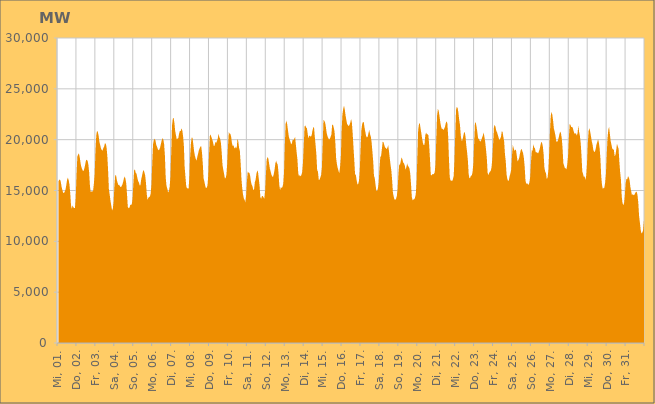
| Category | Series 0 |
|---|---|
|  Mi, 01.  | 15880.041 |
|  Mi, 01.  | 16034.122 |
|  Mi, 01.  | 16085.192 |
|  Mi, 01.  | 15870.947 |
|  Mi, 01.  | 15383.045 |
|  Mi, 01.  | 15050.116 |
|  Mi, 01.  | 14788.443 |
|  Mi, 01.  | 14753.493 |
|  Mi, 01.  | 14880.313 |
|  Mi, 01.  | 15084.558 |
|  Mi, 01.  | 15527.046 |
|  Mi, 01.  | 16042.473 |
|  Mi, 01.  | 16257.262 |
|  Mi, 01.  | 16038.109 |
|  Mi, 01.  | 15592.112 |
|  Mi, 01.  | 14759.255 |
|  Mi, 01.  | 13544.057 |
|  Do, 02.  | 13185.308 |
|  Do, 02.  | 13539.781 |
|  Do, 02.  | 13343.718 |
|  Do, 02.  | 13276.531 |
|  Do, 02.  | 13268.497 |
|  Do, 02.  | 14324.493 |
|  Do, 02.  | 16546.321 |
|  Do, 02.  | 18334.495 |
|  Do, 02.  | 18529.386 |
|  Do, 02.  | 18645.829 |
|  Do, 02.  | 18298.354 |
|  Do, 02.  | 17743.645 |
|  Do, 02.  | 17327.552 |
|  Do, 02.  | 17116.565 |
|  Do, 02.  | 16951.213 |
|  Do, 02.  | 16925.661 |
|  Do, 02.  | 17204.78 |
|  Do, 02.  | 17580.497 |
|  Do, 02.  | 17954.326 |
|  Do, 02.  | 18026.506 |
|  Do, 02.  | 17922.085 |
|  Do, 02.  | 17527.998 |
|  Do, 02.  | 16774.685 |
|  Do, 02.  | 15423.487 |
|  Fr, 03.  | 14831.139 |
|  Fr, 03.  | 14932.915 |
|  Fr, 03.  | 14888.233 |
|  Fr, 03.  | 14989.779 |
|  Fr, 03.  | 15675.474 |
|  Fr, 03.  | 16621.835 |
|  Fr, 03.  | 18924.878 |
|  Fr, 03.  | 20422.545 |
|  Fr, 03.  | 20873.764 |
|  Fr, 03.  | 20752.088 |
|  Fr, 03.  | 20384.484 |
|  Fr, 03.  | 19778.757 |
|  Fr, 03.  | 19476.086 |
|  Fr, 03.  | 19128.711 |
|  Fr, 03.  | 18979.027 |
|  Fr, 03.  | 18930.172 |
|  Fr, 03.  | 19176.02 |
|  Fr, 03.  | 19332.624 |
|  Fr, 03.  | 19640.675 |
|  Fr, 03.  | 19613.561 |
|  Fr, 03.  | 19270.293 |
|  Fr, 03.  | 18414.271 |
|  Fr, 03.  | 16966.94 |
|  Fr, 03.  | 15114.73 |
|  Sa, 04.  | 14612.082 |
|  Sa, 04.  | 13985.811 |
|  Sa, 04.  | 13521.356 |
|  Sa, 04.  | 13044.978 |
|  Sa, 04.  | 13217.953 |
|  Sa, 04.  | 13889.212 |
|  Sa, 04.  | 15426.012 |
|  Sa, 04.  | 16461.014 |
|  Sa, 04.  | 16533.182 |
|  Sa, 04.  | 16057.003 |
|  Sa, 04.  | 15760.044 |
|  Sa, 04.  | 15549.797 |
|  Sa, 04.  | 15554.22 |
|  Sa, 04.  | 15423.924 |
|  Sa, 04.  | 15330.903 |
|  Sa, 04.  | 15406.458 |
|  Sa, 04.  | 15567.541 |
|  Sa, 04.  | 15827.533 |
|  Sa, 04.  | 16173.715 |
|  Sa, 04.  | 16384.077 |
|  Sa, 04.  | 16154.24 |
|  Sa, 04.  | 15698.653 |
|  Sa, 04.  | 14590.799 |
|  Sa, 04.  | 13380.864 |
|  So, 05.  | 13252.382 |
|  So, 05.  | 13308.067 |
|  So, 05.  | 13564.349 |
|  So, 05.  | 13605.745 |
|  So, 05.  | 13624.813 |
|  So, 05.  | 14231.309 |
|  So, 05.  | 15653.347 |
|  So, 05.  | 16980.263 |
|  So, 05.  | 17071.013 |
|  So, 05.  | 16729.561 |
|  So, 05.  | 16661.179 |
|  So, 05.  | 16287.891 |
|  So, 05.  | 15949.642 |
|  So, 05.  | 15797.782 |
|  So, 05.  | 15513.905 |
|  So, 05.  | 15527.349 |
|  So, 05.  | 16120.102 |
|  So, 05.  | 16438.563 |
|  So, 05.  | 16838.327 |
|  So, 05.  | 17015.614 |
|  So, 05.  | 16801.253 |
|  So, 05.  | 16489.51 |
|  So, 05.  | 15761.237 |
|  So, 05.  | 14645.248 |
|  Mo, 06.  | 14077.656 |
|  Mo, 06.  | 14279.456 |
|  Mo, 06.  | 14371.757 |
|  Mo, 06.  | 14404.387 |
|  Mo, 06.  | 14709.623 |
|  Mo, 06.  | 15647.929 |
|  Mo, 06.  | 17808.847 |
|  Mo, 06.  | 19580.43 |
|  Mo, 06.  | 19958.468 |
|  Mo, 06.  | 20102.531 |
|  Mo, 06.  | 19925.509 |
|  Mo, 06.  | 19492.374 |
|  Mo, 06.  | 19316.96 |
|  Mo, 06.  | 19071.961 |
|  Mo, 06.  | 18957.447 |
|  Mo, 06.  | 19039.489 |
|  Mo, 06.  | 19253.172 |
|  Mo, 06.  | 19615.031 |
|  Mo, 06.  | 19939.709 |
|  Mo, 06.  | 20167.338 |
|  Mo, 06.  | 20010.564 |
|  Mo, 06.  | 19557.624 |
|  Mo, 06.  | 18429.47 |
|  Mo, 06.  | 16313.459 |
|  Di, 07.  | 15460.943 |
|  Di, 07.  | 15186.29 |
|  Di, 07.  | 14807.417 |
|  Di, 07.  | 14923.011 |
|  Di, 07.  | 15358.95 |
|  Di, 07.  | 16326.431 |
|  Di, 07.  | 18744.26 |
|  Di, 07.  | 21374.51 |
|  Di, 07.  | 22057.131 |
|  Di, 07.  | 22163.99 |
|  Di, 07.  | 21668.681 |
|  Di, 07.  | 20855.01 |
|  Di, 07.  | 20453.689 |
|  Di, 07.  | 20022.649 |
|  Di, 07.  | 20097.719 |
|  Di, 07.  | 20164.575 |
|  Di, 07.  | 20600.641 |
|  Di, 07.  | 20866.397 |
|  Di, 07.  | 20845.868 |
|  Di, 07.  | 21113.432 |
|  Di, 07.  | 20930.506 |
|  Di, 07.  | 20367.816 |
|  Di, 07.  | 19468.109 |
|  Di, 07.  | 17361.251 |
|  Mi, 08.  | 16383.988 |
|  Mi, 08.  | 15448.785 |
|  Mi, 08.  | 15216.931 |
|  Mi, 08.  | 15213.723 |
|  Mi, 08.  | 15159.305 |
|  Mi, 08.  | 16350.492 |
|  Mi, 08.  | 18376.808 |
|  Mi, 08.  | 19673.498 |
|  Mi, 08.  | 20209.771 |
|  Mi, 08.  | 20179.549 |
|  Mi, 08.  | 19563.683 |
|  Mi, 08.  | 18856.715 |
|  Mi, 08.  | 18421.741 |
|  Mi, 08.  | 18141.797 |
|  Mi, 08.  | 17931.113 |
|  Mi, 08.  | 18285.161 |
|  Mi, 08.  | 18597.726 |
|  Mi, 08.  | 18935.935 |
|  Mi, 08.  | 19150.474 |
|  Mi, 08.  | 19309.904 |
|  Mi, 08.  | 19364.358 |
|  Mi, 08.  | 18730.201 |
|  Mi, 08.  | 17663.766 |
|  Mi, 08.  | 16191.754 |
|  Do, 09.  | 15892.97 |
|  Do, 09.  | 15498.623 |
|  Do, 09.  | 15238.641 |
|  Do, 09.  | 15276.099 |
|  Do, 09.  | 15500.022 |
|  Do, 09.  | 16552.781 |
|  Do, 09.  | 18679.384 |
|  Do, 09.  | 20365.526 |
|  Do, 09.  | 20523.494 |
|  Do, 09.  | 20223.417 |
|  Do, 09.  | 20026.581 |
|  Do, 09.  | 19733.31 |
|  Do, 09.  | 19374.838 |
|  Do, 09.  | 19419.141 |
|  Do, 09.  | 19768.99 |
|  Do, 09.  | 19686.396 |
|  Do, 09.  | 19865.239 |
|  Do, 09.  | 20117.086 |
|  Do, 09.  | 20591.997 |
|  Do, 09.  | 20233.36 |
|  Do, 09.  | 20082.685 |
|  Do, 09.  | 19670.782 |
|  Do, 09.  | 18723.395 |
|  Do, 09.  | 17511.287 |
|  Fr, 10.  | 17037.412 |
|  Fr, 10.  | 16636.664 |
|  Fr, 10.  | 16203.845 |
|  Fr, 10.  | 16219.213 |
|  Fr, 10.  | 16579.176 |
|  Fr, 10.  | 17677.642 |
|  Fr, 10.  | 19413.372 |
|  Fr, 10.  | 20752.068 |
|  Fr, 10.  | 20598.591 |
|  Fr, 10.  | 20567.151 |
|  Fr, 10.  | 20266.1 |
|  Fr, 10.  | 19657.743 |
|  Fr, 10.  | 19372.545 |
|  Fr, 10.  | 19450.543 |
|  Fr, 10.  | 19174.48 |
|  Fr, 10.  | 19150.988 |
|  Fr, 10.  | 19310.221 |
|  Fr, 10.  | 19128.172 |
|  Fr, 10.  | 20125.229 |
|  Fr, 10.  | 19832.548 |
|  Fr, 10.  | 19200.393 |
|  Fr, 10.  | 18877.442 |
|  Fr, 10.  | 17701.637 |
|  Fr, 10.  | 16155.879 |
|  Sa, 11.  | 15246.987 |
|  Sa, 11.  | 14600.332 |
|  Sa, 11.  | 14239.275 |
|  Sa, 11.  | 14074.015 |
|  Sa, 11.  | 13847.225 |
|  Sa, 11.  | 14582.451 |
|  Sa, 11.  | 15938.336 |
|  Sa, 11.  | 16902.586 |
|  Sa, 11.  | 16742.432 |
|  Sa, 11.  | 16744.732 |
|  Sa, 11.  | 16461.098 |
|  Sa, 11.  | 15885.927 |
|  Sa, 11.  | 15571.146 |
|  Sa, 11.  | 15411.787 |
|  Sa, 11.  | 15049.862 |
|  Sa, 11.  | 15098.78 |
|  Sa, 11.  | 15829.965 |
|  Sa, 11.  | 16076.397 |
|  Sa, 11.  | 16635.179 |
|  Sa, 11.  | 16969.503 |
|  Sa, 11.  | 16819.857 |
|  Sa, 11.  | 16149.63 |
|  Sa, 11.  | 15454.834 |
|  Sa, 11.  | 14352.98 |
|  So, 12.  | 14175.853 |
|  So, 12.  | 14469.028 |
|  So, 12.  | 14453.263 |
|  So, 12.  | 14327.082 |
|  So, 12.  | 14187.671 |
|  So, 12.  | 14941.169 |
|  So, 12.  | 16566.547 |
|  So, 12.  | 18031.981 |
|  So, 12.  | 18290.863 |
|  So, 12.  | 18168.057 |
|  So, 12.  | 17690.295 |
|  So, 12.  | 17161.356 |
|  So, 12.  | 16879.082 |
|  So, 12.  | 16565.149 |
|  So, 12.  | 16379.729 |
|  So, 12.  | 16337.529 |
|  So, 12.  | 16612.5 |
|  So, 12.  | 17048.215 |
|  So, 12.  | 17664.742 |
|  So, 12.  | 17927.058 |
|  So, 12.  | 17687.299 |
|  So, 12.  | 17528.606 |
|  So, 12.  | 16733.919 |
|  So, 12.  | 15541.055 |
|  Mo, 13.  | 15031.703 |
|  Mo, 13.  | 15351.982 |
|  Mo, 13.  | 15231.163 |
|  Mo, 13.  | 15355 |
|  Mo, 13.  | 15667.753 |
|  Mo, 13.  | 16790.889 |
|  Mo, 13.  | 19483.726 |
|  Mo, 13.  | 21570.672 |
|  Mo, 13.  | 21870.924 |
|  Mo, 13.  | 21504.529 |
|  Mo, 13.  | 20913.836 |
|  Mo, 13.  | 20324.873 |
|  Mo, 13.  | 20043.221 |
|  Mo, 13.  | 19806.895 |
|  Mo, 13.  | 19544.648 |
|  Mo, 13.  | 19662.927 |
|  Mo, 13.  | 20006.334 |
|  Mo, 13.  | 19958.419 |
|  Mo, 13.  | 20087.852 |
|  Mo, 13.  | 20273.394 |
|  Mo, 13.  | 19503.34 |
|  Mo, 13.  | 18721.099 |
|  Mo, 13.  | 18021.71 |
|  Mo, 13.  | 16706.814 |
|  Di, 14.  | 16387.099 |
|  Di, 14.  | 16546 |
|  Di, 14.  | 16390.004 |
|  Di, 14.  | 16526.528 |
|  Di, 14.  | 16824.149 |
|  Di, 14.  | 17735.442 |
|  Di, 14.  | 19448.236 |
|  Di, 14.  | 21292.098 |
|  Di, 14.  | 21405.298 |
|  Di, 14.  | 21195.148 |
|  Di, 14.  | 21130.317 |
|  Di, 14.  | 20559.042 |
|  Di, 14.  | 20125.591 |
|  Di, 14.  | 20407.556 |
|  Di, 14.  | 20355.032 |
|  Di, 14.  | 20284.389 |
|  Di, 14.  | 20431.3 |
|  Di, 14.  | 20878.607 |
|  Di, 14.  | 21203.722 |
|  Di, 14.  | 21214.099 |
|  Di, 14.  | 20268.05 |
|  Di, 14.  | 19469.083 |
|  Di, 14.  | 18514.477 |
|  Di, 14.  | 16991.559 |
|  Mi, 15.  | 16847.458 |
|  Mi, 15.  | 16040.803 |
|  Mi, 15.  | 16061.648 |
|  Mi, 15.  | 16283.236 |
|  Mi, 15.  | 16520.522 |
|  Mi, 15.  | 17273.901 |
|  Mi, 15.  | 19612.663 |
|  Mi, 15.  | 21963.743 |
|  Mi, 15.  | 21858.682 |
|  Mi, 15.  | 21707.712 |
|  Mi, 15.  | 21252.427 |
|  Mi, 15.  | 20686.306 |
|  Mi, 15.  | 20357.232 |
|  Mi, 15.  | 20157.41 |
|  Mi, 15.  | 20002.422 |
|  Mi, 15.  | 20093.886 |
|  Mi, 15.  | 20264.008 |
|  Mi, 15.  | 20517.939 |
|  Mi, 15.  | 21456.077 |
|  Mi, 15.  | 21466.068 |
|  Mi, 15.  | 21188.254 |
|  Mi, 15.  | 20784.67 |
|  Mi, 15.  | 19743.887 |
|  Mi, 15.  | 18204.608 |
|  Do, 16.  | 17605.861 |
|  Do, 16.  | 17215.191 |
|  Do, 16.  | 16951.032 |
|  Do, 16.  | 16688.128 |
|  Do, 16.  | 17303.665 |
|  Do, 16.  | 18294.239 |
|  Do, 16.  | 20916.964 |
|  Do, 16.  | 22470.083 |
|  Do, 16.  | 23029.637 |
|  Do, 16.  | 23336.985 |
|  Do, 16.  | 22952.673 |
|  Do, 16.  | 22362.799 |
|  Do, 16.  | 21910.078 |
|  Do, 16.  | 21530.37 |
|  Do, 16.  | 21439.008 |
|  Do, 16.  | 21323.838 |
|  Do, 16.  | 21477.209 |
|  Do, 16.  | 21678.888 |
|  Do, 16.  | 22021.014 |
|  Do, 16.  | 21668.792 |
|  Do, 16.  | 20598.531 |
|  Do, 16.  | 19264.384 |
|  Do, 16.  | 18021.871 |
|  Do, 16.  | 16615.195 |
|  Fr, 17.  | 16531.623 |
|  Fr, 17.  | 16014.392 |
|  Fr, 17.  | 15599.381 |
|  Fr, 17.  | 15631.952 |
|  Fr, 17.  | 15952.585 |
|  Fr, 17.  | 16987.947 |
|  Fr, 17.  | 19032.814 |
|  Fr, 17.  | 20926.23 |
|  Fr, 17.  | 21521.362 |
|  Fr, 17.  | 21742.12 |
|  Fr, 17.  | 21731.842 |
|  Fr, 17.  | 21194.14 |
|  Fr, 17.  | 20789.732 |
|  Fr, 17.  | 20356.575 |
|  Fr, 17.  | 20218.214 |
|  Fr, 17.  | 20286.363 |
|  Fr, 17.  | 20640.871 |
|  Fr, 17.  | 20967.495 |
|  Fr, 17.  | 20528.448 |
|  Fr, 17.  | 20304.983 |
|  Fr, 17.  | 19734.042 |
|  Fr, 17.  | 18814.484 |
|  Fr, 17.  | 17879.036 |
|  Fr, 17.  | 16434.109 |
|  Sa, 18.  | 16199.459 |
|  Sa, 18.  | 15538.8 |
|  Sa, 18.  | 14968.539 |
|  Sa, 18.  | 14953.717 |
|  Sa, 18.  | 15237.275 |
|  Sa, 18.  | 15791.739 |
|  Sa, 18.  | 17204.994 |
|  Sa, 18.  | 18283.453 |
|  Sa, 18.  | 18401.569 |
|  Sa, 18.  | 19071.108 |
|  Sa, 18.  | 19802.959 |
|  Sa, 18.  | 19756.433 |
|  Sa, 18.  | 19486.193 |
|  Sa, 18.  | 19237.859 |
|  Sa, 18.  | 19184.197 |
|  Sa, 18.  | 19067.496 |
|  Sa, 18.  | 19200.048 |
|  Sa, 18.  | 19462.315 |
|  Sa, 18.  | 18882.537 |
|  Sa, 18.  | 18175.165 |
|  Sa, 18.  | 17522.573 |
|  Sa, 18.  | 16960.988 |
|  Sa, 18.  | 16015.739 |
|  Sa, 18.  | 14795.914 |
|  So, 19.  | 14392.189 |
|  So, 19.  | 14114.877 |
|  So, 19.  | 14074.014 |
|  So, 19.  | 14204.609 |
|  So, 19.  | 14473.675 |
|  So, 19.  | 15143.798 |
|  So, 19.  | 16607.353 |
|  So, 19.  | 17577.062 |
|  So, 19.  | 17522.72 |
|  So, 19.  | 17910.223 |
|  So, 19.  | 18261.334 |
|  So, 19.  | 18064.018 |
|  So, 19.  | 17759.215 |
|  So, 19.  | 17672.121 |
|  So, 19.  | 17466.892 |
|  So, 19.  | 17052.788 |
|  So, 19.  | 17283.407 |
|  So, 19.  | 17645.552 |
|  So, 19.  | 17434.072 |
|  So, 19.  | 17322.944 |
|  So, 19.  | 17157.905 |
|  So, 19.  | 16641.106 |
|  So, 19.  | 15551.245 |
|  So, 19.  | 14344.445 |
|  Mo, 20.  | 14045.04 |
|  Mo, 20.  | 14117.585 |
|  Mo, 20.  | 14143.037 |
|  Mo, 20.  | 14297.298 |
|  Mo, 20.  | 14661.214 |
|  Mo, 20.  | 15851.486 |
|  Mo, 20.  | 18434.539 |
|  Mo, 20.  | 20933.926 |
|  Mo, 20.  | 21509.881 |
|  Mo, 20.  | 21651.709 |
|  Mo, 20.  | 21125.732 |
|  Mo, 20.  | 20629.734 |
|  Mo, 20.  | 20119.44 |
|  Mo, 20.  | 19681.526 |
|  Mo, 20.  | 19468.253 |
|  Mo, 20.  | 19507.296 |
|  Mo, 20.  | 20433.905 |
|  Mo, 20.  | 20683.649 |
|  Mo, 20.  | 20535.315 |
|  Mo, 20.  | 20529.948 |
|  Mo, 20.  | 20425.819 |
|  Mo, 20.  | 19420.128 |
|  Mo, 20.  | 18058.279 |
|  Mo, 20.  | 16547.298 |
|  Di, 21.  | 16473.199 |
|  Di, 21.  | 16615.035 |
|  Di, 21.  | 16598.876 |
|  Di, 21.  | 16634.09 |
|  Di, 21.  | 16801.218 |
|  Di, 21.  | 17602.559 |
|  Di, 21.  | 20210.595 |
|  Di, 21.  | 22374.063 |
|  Di, 21.  | 23021.669 |
|  Di, 21.  | 22839.412 |
|  Di, 21.  | 22334.119 |
|  Di, 21.  | 21735.706 |
|  Di, 21.  | 21286.938 |
|  Di, 21.  | 21049.702 |
|  Di, 21.  | 21072.806 |
|  Di, 21.  | 20949.723 |
|  Di, 21.  | 21086.704 |
|  Di, 21.  | 21265.025 |
|  Di, 21.  | 21624.703 |
|  Di, 21.  | 21812.149 |
|  Di, 21.  | 21592.729 |
|  Di, 21.  | 20354.637 |
|  Di, 21.  | 18145.572 |
|  Di, 21.  | 16323.402 |
|  Mi, 22.  | 15974.487 |
|  Mi, 22.  | 15981.342 |
|  Mi, 22.  | 15927.306 |
|  Mi, 22.  | 16098.273 |
|  Mi, 22.  | 16421.103 |
|  Mi, 22.  | 17924.6 |
|  Mi, 22.  | 20560.961 |
|  Mi, 22.  | 22929.776 |
|  Mi, 22.  | 23230.172 |
|  Mi, 22.  | 23116.132 |
|  Mi, 22.  | 22649.539 |
|  Mi, 22.  | 21946.361 |
|  Mi, 22.  | 21435.504 |
|  Mi, 22.  | 20411.59 |
|  Mi, 22.  | 19895.127 |
|  Mi, 22.  | 19924.83 |
|  Mi, 22.  | 20287.375 |
|  Mi, 22.  | 20658.755 |
|  Mi, 22.  | 20763.781 |
|  Mi, 22.  | 20322.691 |
|  Mi, 22.  | 19435.134 |
|  Mi, 22.  | 18783.215 |
|  Mi, 22.  | 17960.274 |
|  Mi, 22.  | 16623.872 |
|  Do, 23.  | 16175.135 |
|  Do, 23.  | 16275.728 |
|  Do, 23.  | 16467.631 |
|  Do, 23.  | 16471.662 |
|  Do, 23.  | 16863.268 |
|  Do, 23.  | 17705.058 |
|  Do, 23.  | 19719.662 |
|  Do, 23.  | 21701.591 |
|  Do, 23.  | 21670.309 |
|  Do, 23.  | 21281.735 |
|  Do, 23.  | 20746.671 |
|  Do, 23.  | 20114.6 |
|  Do, 23.  | 20086.038 |
|  Do, 23.  | 19874.392 |
|  Do, 23.  | 19816.843 |
|  Do, 23.  | 19965.964 |
|  Do, 23.  | 20202.749 |
|  Do, 23.  | 20407.134 |
|  Do, 23.  | 20702.601 |
|  Do, 23.  | 20254.016 |
|  Do, 23.  | 19754.183 |
|  Do, 23.  | 19027.298 |
|  Do, 23.  | 18193.883 |
|  Do, 23.  | 16765.907 |
|  Fr, 24.  | 16513.192 |
|  Fr, 24.  | 16748.537 |
|  Fr, 24.  | 16851.103 |
|  Fr, 24.  | 16940.665 |
|  Fr, 24.  | 17279.838 |
|  Fr, 24.  | 18160.453 |
|  Fr, 24.  | 19631.992 |
|  Fr, 24.  | 21248.27 |
|  Fr, 24.  | 21456.384 |
|  Fr, 24.  | 21255.988 |
|  Fr, 24.  | 20865.657 |
|  Fr, 24.  | 20713.33 |
|  Fr, 24.  | 20456.714 |
|  Fr, 24.  | 20186.299 |
|  Fr, 24.  | 19962.586 |
|  Fr, 24.  | 20098.472 |
|  Fr, 24.  | 20291.848 |
|  Fr, 24.  | 20836.332 |
|  Fr, 24.  | 20758.583 |
|  Fr, 24.  | 20254.754 |
|  Fr, 24.  | 19801.901 |
|  Fr, 24.  | 18561.67 |
|  Fr, 24.  | 17903.007 |
|  Fr, 24.  | 16606.946 |
|  Sa, 25.  | 16138.333 |
|  Sa, 25.  | 15931.414 |
|  Sa, 25.  | 16028.355 |
|  Sa, 25.  | 16436.465 |
|  Sa, 25.  | 16704.949 |
|  Sa, 25.  | 17069.093 |
|  Sa, 25.  | 18526.396 |
|  Sa, 25.  | 19486.444 |
|  Sa, 25.  | 19172.96 |
|  Sa, 25.  | 18897.336 |
|  Sa, 25.  | 19023.578 |
|  Sa, 25.  | 18973.358 |
|  Sa, 25.  | 18433.435 |
|  Sa, 25.  | 17859.265 |
|  Sa, 25.  | 18000.961 |
|  Sa, 25.  | 18194.41 |
|  Sa, 25.  | 18617.953 |
|  Sa, 25.  | 18961.284 |
|  Sa, 25.  | 19108.906 |
|  Sa, 25.  | 18886.475 |
|  Sa, 25.  | 18665.007 |
|  Sa, 25.  | 18176.205 |
|  Sa, 25.  | 17335.795 |
|  Sa, 25.  | 15978.706 |
|  So, 26.  | 15643.406 |
|  So, 26.  | 15718.917 |
|  So, 26.  | 15623.693 |
|  So, 26.  | 15555.805 |
|  So, 26.  | 15795.692 |
|  So, 26.  | 16344.722 |
|  So, 26.  | 17807.719 |
|  So, 26.  | 18953.481 |
|  So, 26.  | 18909.686 |
|  So, 26.  | 19539.587 |
|  So, 26.  | 19239.991 |
|  So, 26.  | 19143.9 |
|  So, 26.  | 18775.193 |
|  So, 26.  | 18766.864 |
|  So, 26.  | 18723.332 |
|  So, 26.  | 18644.373 |
|  So, 26.  | 18836.05 |
|  So, 26.  | 19074.989 |
|  So, 26.  | 19454.259 |
|  So, 26.  | 19783.059 |
|  So, 26.  | 19684.72 |
|  So, 26.  | 19354.348 |
|  So, 26.  | 18573.815 |
|  So, 26.  | 17244.971 |
|  Mo, 27.  | 16849.338 |
|  Mo, 27.  | 16708.664 |
|  Mo, 27.  | 16108.644 |
|  Mo, 27.  | 16253.11 |
|  Mo, 27.  | 16970.294 |
|  Mo, 27.  | 18637.537 |
|  Mo, 27.  | 20722.859 |
|  Mo, 27.  | 22322.215 |
|  Mo, 27.  | 22734.779 |
|  Mo, 27.  | 22465.903 |
|  Mo, 27.  | 21867.507 |
|  Mo, 27.  | 21100.921 |
|  Mo, 27.  | 20781.887 |
|  Mo, 27.  | 20411.922 |
|  Mo, 27.  | 19841.024 |
|  Mo, 27.  | 19773.793 |
|  Mo, 27.  | 19884.882 |
|  Mo, 27.  | 20168.787 |
|  Mo, 27.  | 20542.374 |
|  Mo, 27.  | 20799.911 |
|  Mo, 27.  | 20631.84 |
|  Mo, 27.  | 20122.884 |
|  Mo, 27.  | 19185.063 |
|  Mo, 27.  | 17699.599 |
|  Di, 28.  | 17432.633 |
|  Di, 28.  | 17196.24 |
|  Di, 28.  | 17185.751 |
|  Di, 28.  | 17081.447 |
|  Di, 28.  | 17584.983 |
|  Di, 28.  | 18416.197 |
|  Di, 28.  | 20190.713 |
|  Di, 28.  | 21525.335 |
|  Di, 28.  | 21467.786 |
|  Di, 28.  | 21246.713 |
|  Di, 28.  | 21260.373 |
|  Di, 28.  | 21150.055 |
|  Di, 28.  | 20854.211 |
|  Di, 28.  | 20594.612 |
|  Di, 28.  | 20599.556 |
|  Di, 28.  | 20628.362 |
|  Di, 28.  | 20404.152 |
|  Di, 28.  | 20633.869 |
|  Di, 28.  | 21373.539 |
|  Di, 28.  | 20764.398 |
|  Di, 28.  | 20371.58 |
|  Di, 28.  | 19671.209 |
|  Di, 28.  | 18459.695 |
|  Di, 28.  | 16887.377 |
|  Mi, 29.  | 16625.047 |
|  Mi, 29.  | 16332.174 |
|  Mi, 29.  | 16387.492 |
|  Mi, 29.  | 16034.264 |
|  Mi, 29.  | 16474.508 |
|  Mi, 29.  | 17651.785 |
|  Mi, 29.  | 19622.963 |
|  Mi, 29.  | 20833.423 |
|  Mi, 29.  | 21133.353 |
|  Mi, 29.  | 20788.062 |
|  Mi, 29.  | 20352.001 |
|  Mi, 29.  | 19860.899 |
|  Mi, 29.  | 19547.287 |
|  Mi, 29.  | 18984.531 |
|  Mi, 29.  | 18805.328 |
|  Mi, 29.  | 18799.595 |
|  Mi, 29.  | 19103.398 |
|  Mi, 29.  | 19527.681 |
|  Mi, 29.  | 19752.017 |
|  Mi, 29.  | 20049.656 |
|  Mi, 29.  | 19731.112 |
|  Mi, 29.  | 19147.99 |
|  Mi, 29.  | 18142.038 |
|  Mi, 29.  | 16398.932 |
|  Do, 30.  | 15566.877 |
|  Do, 30.  | 15153.782 |
|  Do, 30.  | 15237.57 |
|  Do, 30.  | 15299.078 |
|  Do, 30.  | 15780.246 |
|  Do, 30.  | 16651.244 |
|  Do, 30.  | 18552.65 |
|  Do, 30.  | 20166.862 |
|  Do, 30.  | 20973.273 |
|  Do, 30.  | 21256.574 |
|  Do, 30.  | 20557.283 |
|  Do, 30.  | 19855.829 |
|  Do, 30.  | 19490.022 |
|  Do, 30.  | 19126.766 |
|  Do, 30.  | 19026.267 |
|  Do, 30.  | 19019.703 |
|  Do, 30.  | 18387.384 |
|  Do, 30.  | 18485.613 |
|  Do, 30.  | 18972.342 |
|  Do, 30.  | 19608.713 |
|  Do, 30.  | 19314.871 |
|  Do, 30.  | 19124.724 |
|  Do, 30.  | 17842.246 |
|  Do, 30.  | 16798.616 |
|  Fr, 31.  | 16087.128 |
|  Fr, 31.  | 14416.044 |
|  Fr, 31.  | 13769.418 |
|  Fr, 31.  | 13562.085 |
|  Fr, 31.  | 13775.937 |
|  Fr, 31.  | 14580.254 |
|  Fr, 31.  | 15738.093 |
|  Fr, 31.  | 16147.308 |
|  Fr, 31.  | 16097.501 |
|  Fr, 31.  | 16420.023 |
|  Fr, 31.  | 16275.572 |
|  Fr, 31.  | 16004.48 |
|  Fr, 31.  | 15331.141 |
|  Fr, 31.  | 14913.227 |
|  Fr, 31.  | 14543.711 |
|  Fr, 31.  | 14652.9 |
|  Fr, 31.  | 14528.324 |
|  Fr, 31.  | 14582.145 |
|  Fr, 31.  | 14738.951 |
|  Fr, 31.  | 14853.118 |
|  Fr, 31.  | 14881.254 |
|  Fr, 31.  | 14548.492 |
|  Fr, 31.  | 13806.737 |
|  Fr, 31.  | 12497.396 |
|  Sa, 01.  | 11862.248 |
|  Sa, 01.  | 11137.937 |
|  Sa, 01.  | 10770.886 |
|  Sa, 01.  | 10856.568 |
|  Sa, 01.  | 11046.324 |
|  Sa, 01.  | 11901.833 |